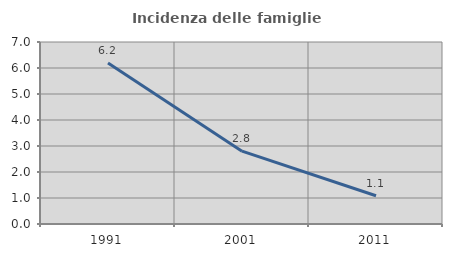
| Category | Incidenza delle famiglie numerose |
|---|---|
| 1991.0 | 6.197 |
| 2001.0 | 2.802 |
| 2011.0 | 1.087 |